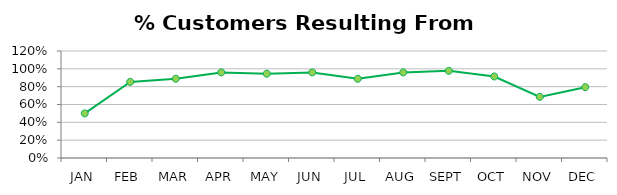
| Category | % Customers from Marketing |
|---|---|
| JAN | 0.5 |
| FEB | 0.853 |
| MAR | 0.889 |
| APR | 0.96 |
| MAY | 0.945 |
| JUN | 0.96 |
| JUL | 0.889 |
| AUG | 0.96 |
| SEPT | 0.978 |
| OCT | 0.914 |
| NOV | 0.686 |
| DEC | 0.795 |